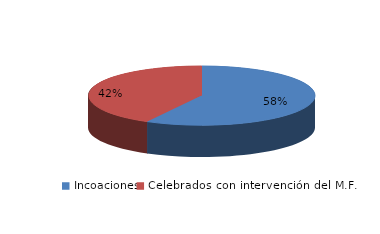
| Category | Series 0 |
|---|---|
| Incoaciones | 16817 |
| Celebrados con intervención del M.F. | 12215 |